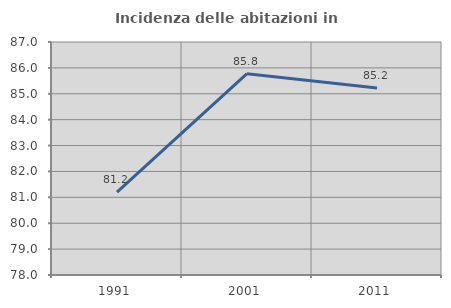
| Category | Incidenza delle abitazioni in proprietà  |
|---|---|
| 1991.0 | 81.201 |
| 2001.0 | 85.775 |
| 2011.0 | 85.222 |